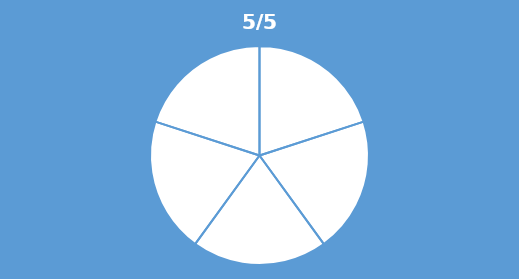
| Category | Series 0 |
|---|---|
| 0 | 0.2 |
| 1 | 0.2 |
| 2 | 0.2 |
| 3 | 0.2 |
| 4 | 0.2 |